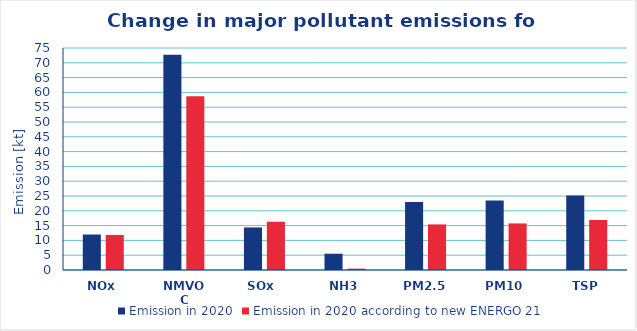
| Category | Emission in 2020 | Emission in 2020 according to new ENERGO 21 |
|---|---|---|
| NOx | 11.985 | 11.837 |
| NMVOC | 72.718 | 58.701 |
| SOx  | 14.375 | 16.307 |
| NH3 | 5.497 | 0.456 |
| PM2.5 | 22.985 | 15.4 |
| PM10 | 23.485 | 15.735 |
| TSP | 25.209 | 16.887 |